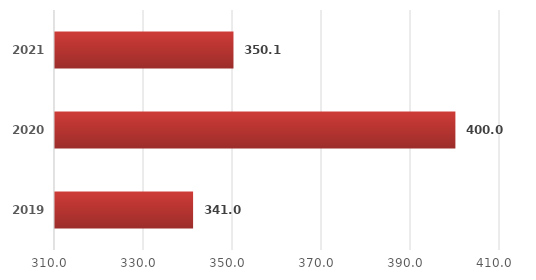
| Category | Series 0 |
|---|---|
| 2019.0 | 341.031 |
| 2020.0 | 399.976 |
| 2021.0 | 350.107 |